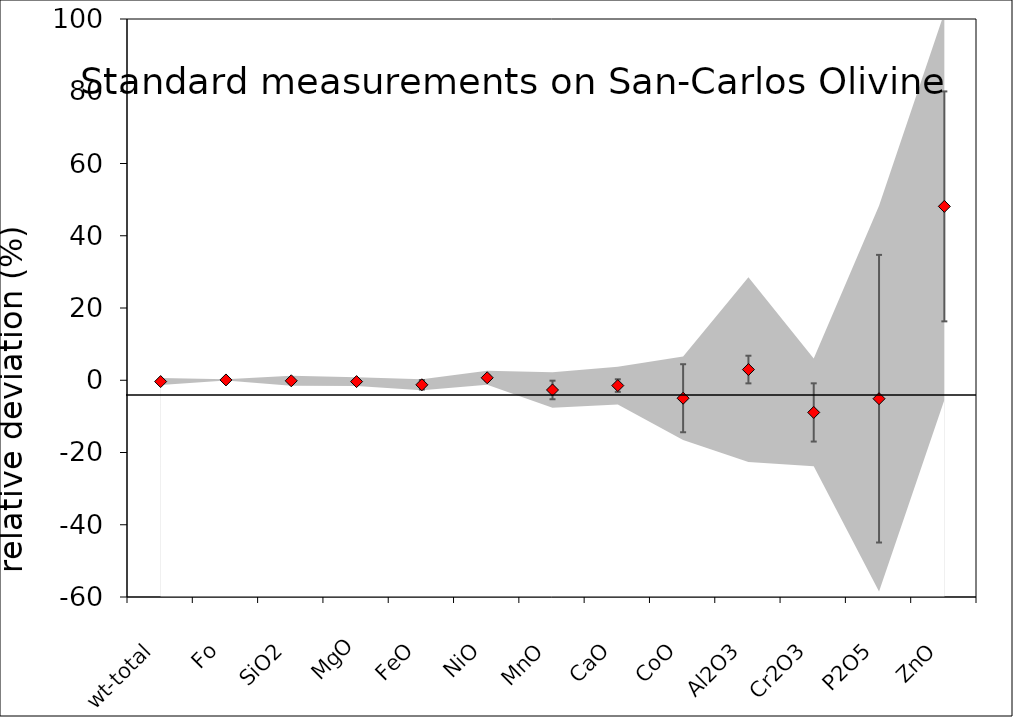
| Category | Series 0 |
|---|---|
| wt-total | -0.367 |
| Fo | 0.084 |
| SiO2 | -0.15 |
| MgO | -0.372 |
| FeO | -1.255 |
| NiO | 0.69 |
| MnO | -2.688 |
| CaO | -1.475 |
| CoO | -4.977 |
| Al2O3 | 2.965 |
| Cr2O3 | -8.91 |
| P2O5 | -5.107 |
| ZnO | 48.13 |